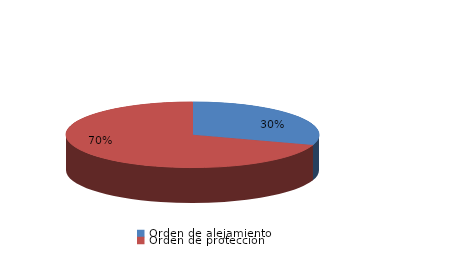
| Category | Series 0 |
|---|---|
| Orden de alejamiento | 3 |
| Orden de protección | 7 |